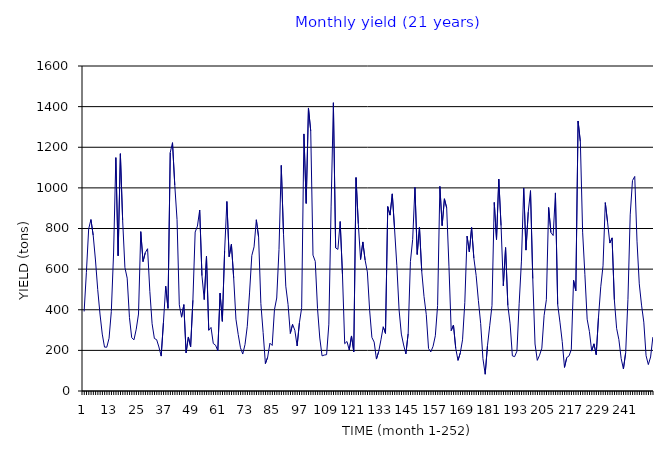
| Category | Yield t |
|---|---|
| 0 | 391.5 |
| 1 | 584.572 |
| 2 | 797.704 |
| 3 | 844.072 |
| 4 | 766.597 |
| 5 | 644.982 |
| 6 | 499.002 |
| 7 | 378.961 |
| 8 | 280.194 |
| 9 | 216.152 |
| 10 | 215.642 |
| 11 | 259.566 |
| 12 | 391.5 |
| 13 | 679.438 |
| 14 | 1148.938 |
| 15 | 665.876 |
| 16 | 1168.22 |
| 17 | 839.748 |
| 18 | 607.652 |
| 19 | 555.634 |
| 20 | 362.043 |
| 21 | 262.548 |
| 22 | 251.917 |
| 23 | 304.328 |
| 24 | 378.962 |
| 25 | 784.566 |
| 26 | 637.13 |
| 27 | 681.305 |
| 28 | 700.5 |
| 29 | 490.769 |
| 30 | 331.184 |
| 31 | 258.539 |
| 32 | 252.704 |
| 33 | 216.645 |
| 34 | 171.868 |
| 35 | 337.788 |
| 36 | 516.225 |
| 37 | 407.002 |
| 38 | 1173.727 |
| 39 | 1222.474 |
| 40 | 1013.634 |
| 41 | 843.74 |
| 42 | 424.281 |
| 43 | 363.361 |
| 44 | 425.139 |
| 45 | 187.785 |
| 46 | 265.998 |
| 47 | 217.831 |
| 48 | 446.881 |
| 49 | 782.408 |
| 50 | 811.729 |
| 51 | 890.956 |
| 52 | 567.746 |
| 53 | 450.099 |
| 54 | 663.238 |
| 55 | 298.983 |
| 56 | 312.852 |
| 57 | 233.737 |
| 58 | 225.54 |
| 59 | 197.972 |
| 60 | 481.693 |
| 61 | 342.892 |
| 62 | 689.39 |
| 63 | 932.957 |
| 64 | 661.218 |
| 65 | 722.057 |
| 66 | 557.001 |
| 67 | 353.608 |
| 68 | 278.226 |
| 69 | 212.714 |
| 70 | 181.946 |
| 71 | 228.543 |
| 72 | 318.553 |
| 73 | 482.765 |
| 74 | 666.569 |
| 75 | 709.64 |
| 76 | 842.975 |
| 77 | 757.663 |
| 78 | 430.241 |
| 79 | 287.627 |
| 80 | 134.852 |
| 81 | 166.577 |
| 82 | 235.25 |
| 83 | 224.142 |
| 84 | 400.525 |
| 85 | 457.783 |
| 86 | 696.553 |
| 87 | 1110.739 |
| 88 | 771.544 |
| 89 | 516.081 |
| 90 | 426.016 |
| 91 | 283.382 |
| 92 | 328.037 |
| 93 | 298.735 |
| 94 | 221.549 |
| 95 | 335.313 |
| 96 | 409.303 |
| 97 | 1265.569 |
| 98 | 923.469 |
| 99 | 1393.33 |
| 100 | 1280.227 |
| 101 | 668.864 |
| 102 | 638.238 |
| 103 | 405.962 |
| 104 | 260.63 |
| 105 | 173.027 |
| 106 | 176.973 |
| 107 | 178.889 |
| 108 | 329.073 |
| 109 | 910.373 |
| 110 | 1419.262 |
| 111 | 704.396 |
| 112 | 697.209 |
| 113 | 834.382 |
| 114 | 576.114 |
| 115 | 232.818 |
| 116 | 243.724 |
| 117 | 201.969 |
| 118 | 270.96 |
| 119 | 192.869 |
| 120 | 1050.826 |
| 121 | 823.264 |
| 122 | 647.415 |
| 123 | 733.79 |
| 124 | 644.603 |
| 125 | 586.219 |
| 126 | 397.151 |
| 127 | 263.709 |
| 128 | 240.83 |
| 129 | 157.164 |
| 130 | 194.312 |
| 131 | 252.191 |
| 132 | 316.108 |
| 133 | 283.754 |
| 134 | 907.961 |
| 135 | 865.92 |
| 136 | 970.507 |
| 137 | 798.222 |
| 138 | 618.956 |
| 139 | 399.172 |
| 140 | 280.163 |
| 141 | 226.647 |
| 142 | 182.676 |
| 143 | 281.801 |
| 144 | 636.954 |
| 145 | 746.44 |
| 146 | 1002.43 |
| 147 | 672.235 |
| 148 | 806.931 |
| 149 | 588.523 |
| 150 | 465.589 |
| 151 | 376.12 |
| 152 | 208.932 |
| 153 | 192.672 |
| 154 | 220.005 |
| 155 | 271.896 |
| 156 | 420.643 |
| 157 | 1007.32 |
| 158 | 814.074 |
| 159 | 946.244 |
| 160 | 901.394 |
| 161 | 614.668 |
| 162 | 297.092 |
| 163 | 324.554 |
| 164 | 209.479 |
| 165 | 150.713 |
| 166 | 186.891 |
| 167 | 251.783 |
| 168 | 434.727 |
| 169 | 762.492 |
| 170 | 684.924 |
| 171 | 804.903 |
| 172 | 653.945 |
| 173 | 569.09 |
| 174 | 444.77 |
| 175 | 332.654 |
| 176 | 159.279 |
| 177 | 82.551 |
| 178 | 222.498 |
| 179 | 321.19 |
| 180 | 420.384 |
| 181 | 928.318 |
| 182 | 745.755 |
| 183 | 1043.012 |
| 184 | 814.363 |
| 185 | 517.985 |
| 186 | 706.095 |
| 187 | 421.244 |
| 188 | 330.472 |
| 189 | 172.964 |
| 190 | 169.216 |
| 191 | 196.097 |
| 192 | 432.089 |
| 193 | 639.489 |
| 194 | 999.387 |
| 195 | 693.63 |
| 196 | 880.548 |
| 197 | 986.422 |
| 198 | 553.139 |
| 199 | 231.366 |
| 200 | 150.781 |
| 201 | 176.392 |
| 202 | 210.873 |
| 203 | 371.253 |
| 204 | 449.161 |
| 205 | 903.508 |
| 206 | 780.517 |
| 207 | 765.507 |
| 208 | 975.173 |
| 209 | 425.699 |
| 210 | 338.926 |
| 211 | 243.021 |
| 212 | 116.13 |
| 213 | 164.467 |
| 214 | 172.772 |
| 215 | 203.564 |
| 216 | 544.957 |
| 217 | 493.385 |
| 218 | 1329.254 |
| 219 | 1227.601 |
| 220 | 782.028 |
| 221 | 572.503 |
| 222 | 353.509 |
| 223 | 292.118 |
| 224 | 196.562 |
| 225 | 232.202 |
| 226 | 178.55 |
| 227 | 362.95 |
| 228 | 513.004 |
| 229 | 616.12 |
| 230 | 927.533 |
| 231 | 831.558 |
| 232 | 728.371 |
| 233 | 753.797 |
| 234 | 448.93 |
| 235 | 308.511 |
| 236 | 252.804 |
| 237 | 160.534 |
| 238 | 108.598 |
| 239 | 189.019 |
| 240 | 451.543 |
| 241 | 867.09 |
| 242 | 1035.927 |
| 243 | 1056.239 |
| 244 | 737.72 |
| 245 | 527.461 |
| 246 | 422.843 |
| 247 | 339.034 |
| 248 | 173.763 |
| 249 | 130.002 |
| 250 | 167.484 |
| 251 | 265.302 |